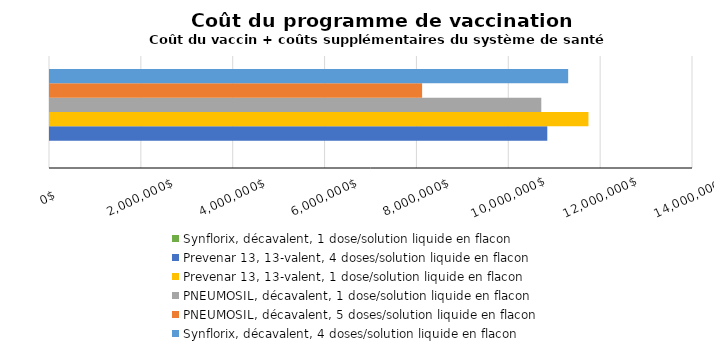
| Category | Synflorix, décavalent, 1 dose/solution liquide en flacon | Prevenar 13, 13-valent, 4 doses/solution liquide en flacon | Prevenar 13, 13-valent, 1 dose/solution liquide en flacon | PNEUMOSIL, décavalent, 1 dose/solution liquide en flacon | PNEUMOSIL, décavalent, 5 doses/solution liquide en flacon | Synflorix, décavalent, 4 doses/solution liquide en flacon |
|---|---|---|---|---|---|---|
| Total
pour 10 ans | 0 | 10827681.908 | 11723467.864 | 10696980.043 | 8102069.838 | 11281950.587 |